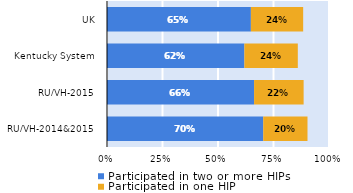
| Category | Participated in two or more HIPs | Participated in one HIP |
|---|---|---|
| RU/VH-2014&2015 | 0.704 | 0.199 |
| RU/VH-2015 | 0.663 | 0.223 |
| Kentucky System | 0.619 | 0.241 |
| UK | 0.648 | 0.236 |